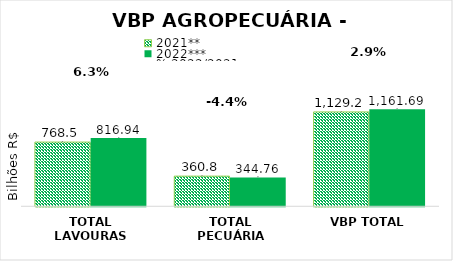
| Category | 2021** | 2022*** |
|---|---|---|
| TOTAL LAVOURAS | 768.454 | 816.938 |
| TOTAL PECUÁRIA | 360.761 | 344.756 |
| VBP TOTAL | 1129.215 | 1161.694 |